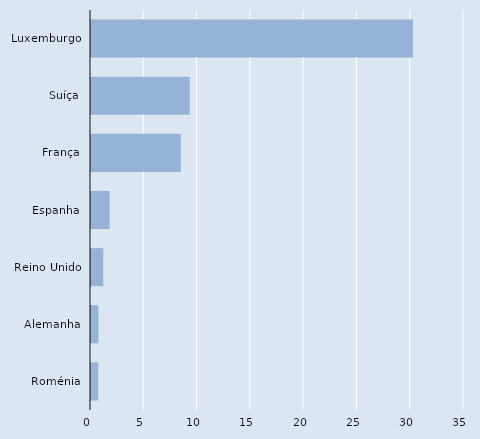
| Category | Series 0 |
|---|---|
| Luxemburgo | 30.21 |
| Suíça | 9.262 |
| França | 8.426 |
| Espanha | 1.752 |
| Reino Unido | 1.153 |
| Alemanha | 0.689 |
| Roménia | 0.675 |